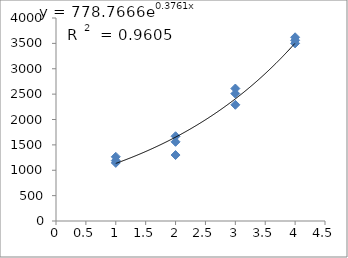
| Category | Series 0 |
|---|---|
| 1.0 | 1190 |
| 1.0 | 1145 |
| 1.0 | 1265 |
| 2.0 | 1670 |
| 2.0 | 1560 |
| 2.0 | 1300 |
| 3.0 | 2510 |
| 3.0 | 2290 |
| 3.0 | 2610 |
| 4.0 | 3500 |
| 4.0 | 3560 |
| 4.0 | 3620 |